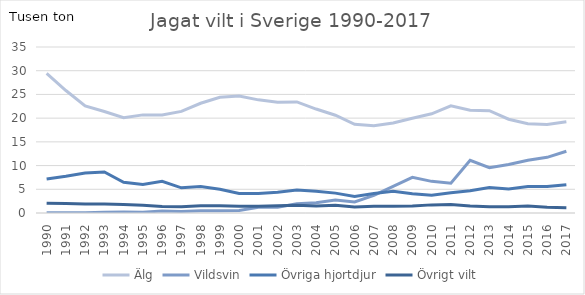
| Category | Älg | Vildsvin | Övriga hjortdjur | Övrigt vilt |
|---|---|---|---|---|
| 1990.0 | 29.419 | 0.038 | 7.172 | 2.046 |
| 1991.0 | 25.82 | 0.066 | 7.734 | 1.982 |
| 1992.0 | 22.557 | 0.073 | 8.416 | 1.874 |
| 1993.0 | 21.392 | 0.178 | 8.637 | 1.893 |
| 1994.0 | 20.085 | 0.187 | 6.471 | 1.78 |
| 1995.0 | 20.689 | 0.171 | 6.024 | 1.61 |
| 1996.0 | 20.675 | 0.422 | 6.671 | 1.367 |
| 1997.0 | 21.424 | 0.342 | 5.309 | 1.325 |
| 1998.0 | 23.138 | 0.455 | 5.57 | 1.51 |
| 1999.0 | 24.402 | 0.477 | 4.998 | 1.531 |
| 2000.0 | 24.672 | 0.537 | 4.104 | 1.434 |
| 2001.0 | 23.855 | 1.198 | 4.132 | 1.438 |
| 2002.0 | 23.348 | 1.222 | 4.352 | 1.534 |
| 2003.0 | 23.423 | 1.937 | 4.853 | 1.654 |
| 2004.0 | 21.92 | 2.139 | 4.574 | 1.484 |
| 2005.0 | 20.615 | 2.732 | 4.192 | 1.655 |
| 2006.0 | 18.698 | 2.328 | 3.46 | 1.278 |
| 2007.0 | 18.381 | 3.733 | 4.133 | 1.421 |
| 2008.0 | 18.967 | 5.633 | 4.588 | 1.441 |
| 2009.0 | 19.979 | 7.509 | 4.062 | 1.491 |
| 2010.0 | 20.914 | 6.672 | 3.746 | 1.713 |
| 2011.0 | 22.585 | 6.262 | 4.247 | 1.812 |
| 2012.0 | 21.659 | 11.091 | 4.682 | 1.461 |
| 2013.0 | 21.582 | 9.562 | 5.383 | 1.337 |
| 2014.0 | 19.77 | 10.219 | 5.078 | 1.325 |
| 2015.0 | 18.84 | 11.129 | 5.594 | 1.463 |
| 2016.0 | 18.641 | 11.733 | 5.569 | 1.201 |
| 2017.0 | 19.239 | 13.018 | 5.969 | 1.116 |